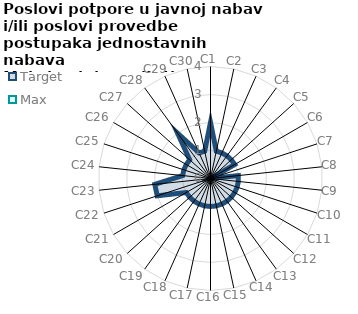
| Category | Target | Max |
|---|---|---|
| C1 | 2 | 0 |
| C2 | 1 | 0 |
| C3 | 1 | 0 |
| C4 | 1 | 0 |
| C5 | 1 | 0 |
| C6 | 1 | 0 |
| C7 | 0 | 0 |
| C8 | 1 | 0 |
| C9 | 1 | 0 |
| C10 | 1 | 0 |
| C11 | 1 | 0 |
| C12 | 1 | 0 |
| C13 | 1 | 0 |
| C14 | 1 | 0 |
| C15 | 1 | 0 |
| C16 | 1 | 0 |
| C17 | 1 | 0 |
| C18 | 1 | 0 |
| C19 | 1 | 0 |
| C20 | 1 | 0 |
| C21 | 1 | 0 |
| C22 | 2 | 0 |
| C23 | 2 | 0 |
| C24 | 1 | 0 |
| C25 | 1 | 0 |
| C26 | 1 | 0 |
| C27 | 1 | 0 |
| C28 | 2 | 0 |
| C29 | 1 | 0 |
| C30 | 1 | 0 |